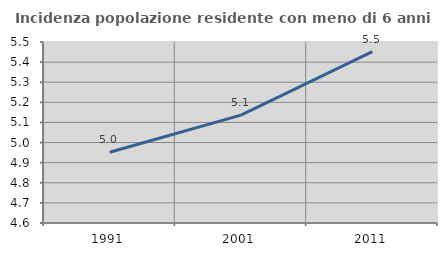
| Category | Incidenza popolazione residente con meno di 6 anni |
|---|---|
| 1991.0 | 4.952 |
| 2001.0 | 5.137 |
| 2011.0 | 5.452 |